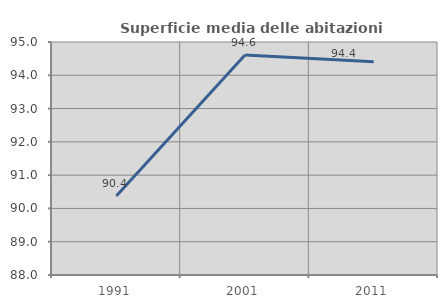
| Category | Superficie media delle abitazioni occupate |
|---|---|
| 1991.0 | 90.372 |
| 2001.0 | 94.607 |
| 2011.0 | 94.409 |